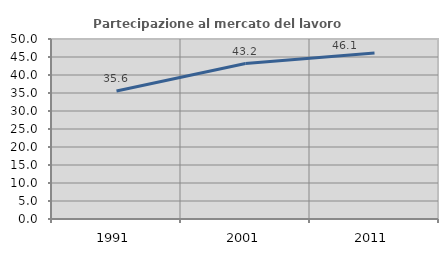
| Category | Partecipazione al mercato del lavoro  femminile |
|---|---|
| 1991.0 | 35.581 |
| 2001.0 | 43.194 |
| 2011.0 | 46.141 |